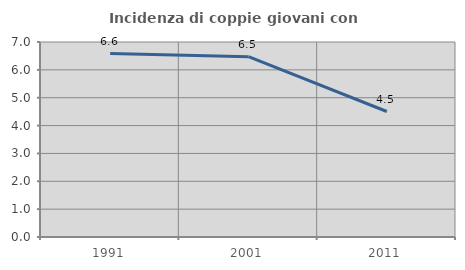
| Category | Incidenza di coppie giovani con figli |
|---|---|
| 1991.0 | 6.587 |
| 2001.0 | 6.475 |
| 2011.0 | 4.505 |